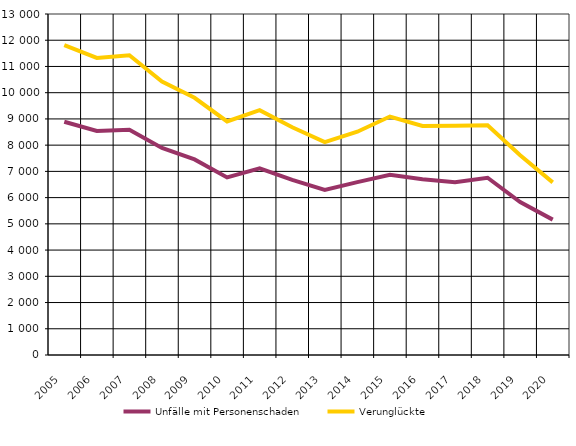
| Category |    Unfälle mit Personenschaden |    Verunglückte  |
|---|---|---|
| 2005.0 | 8893 | 11816 |
| 2006.0 | 8539 | 11326 |
| 2007.0 | 8588 | 11427 |
| 2008.0 | 7893 | 10423 |
| 2009.0 | 7456 | 9805 |
| 2010.0 | 6769 | 8903 |
| 2011.0 | 7114 | 9336 |
| 2012.0 | 6674 | 8680 |
| 2013.0 | 6296 | 8118 |
| 2014.0 | 6591 | 8513 |
| 2015.0 | 6870 | 9092 |
| 2016.0 | 6700 | 8731 |
| 2017.0 | 6587 | 8743 |
| 2018.0 | 6757 | 8761 |
| 2019.0 | 5831 | 7617 |
| 2020.0 | 5161 | 6582 |